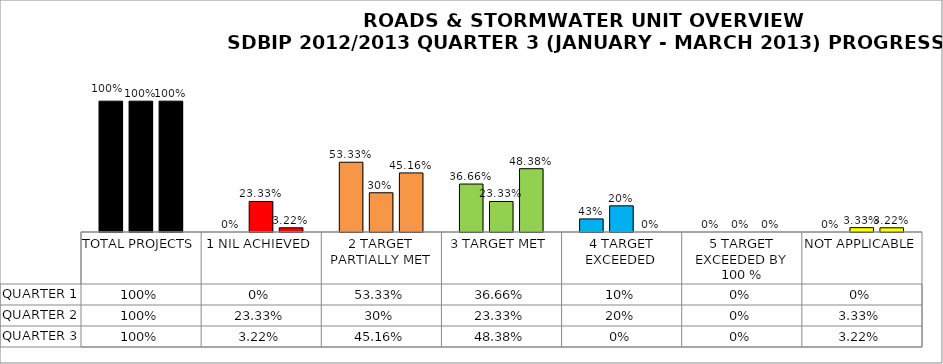
| Category | QUARTER 1 | QUARTER 2 | QUARTER 3 |
|---|---|---|---|
| TOTAL PROJECTS | 1 | 1 | 1 |
| 1 NIL ACHIEVED | 0 | 0.233 | 0.032 |
| 2 TARGET PARTIALLY MET | 0.533 | 0.3 | 0.452 |
| 3 TARGET MET | 0.367 | 0.233 | 0.484 |
| 4 TARGET EXCEEDED | 0.1 | 0.2 | 0 |
| 5 TARGET EXCEEDED BY 100 % | 0 | 0 | 0 |
| NOT APPLICABLE | 0 | 0.033 | 0.032 |